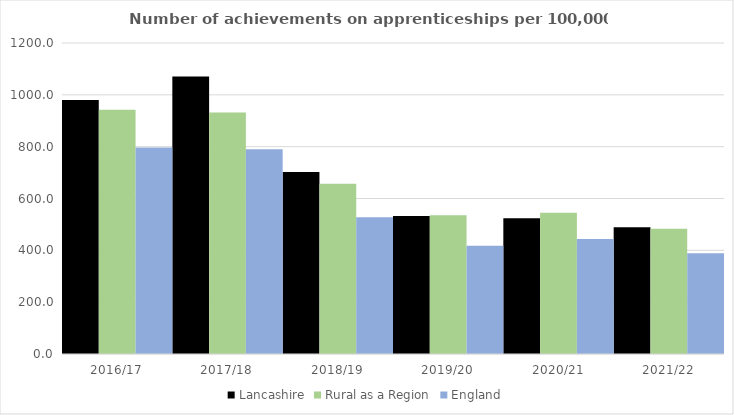
| Category | Lancashire | Rural as a Region | England |
|---|---|---|---|
| 2016/17 | 980.396 | 942.594 | 797 |
| 2017/18 | 1070.637 | 931.709 | 790 |
| 2018/19 | 702.27 | 656.44 | 528 |
| 2019/20 | 532.139 | 535.552 | 418 |
| 2020/21 | 524.172 | 545.333 | 444 |
| 2021/22 | 488.865 | 482.936 | 389 |